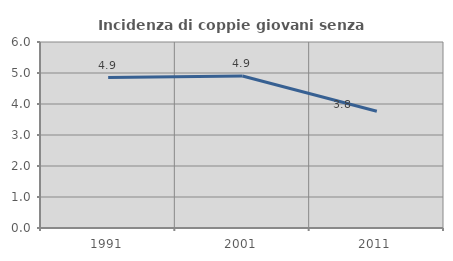
| Category | Incidenza di coppie giovani senza figli |
|---|---|
| 1991.0 | 4.854 |
| 2001.0 | 4.902 |
| 2011.0 | 3.767 |